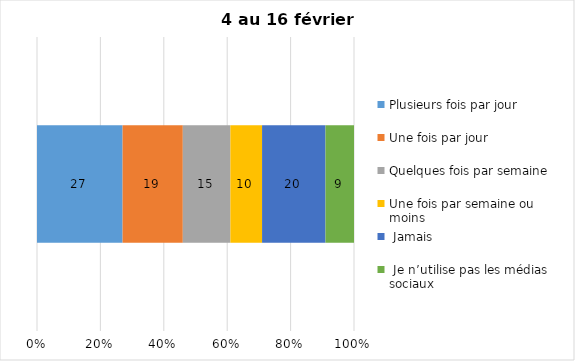
| Category | Plusieurs fois par jour | Une fois par jour | Quelques fois par semaine   | Une fois par semaine ou moins   |  Jamais   |  Je n’utilise pas les médias sociaux |
|---|---|---|---|---|---|---|
| 0 | 27 | 19 | 15 | 10 | 20 | 9 |